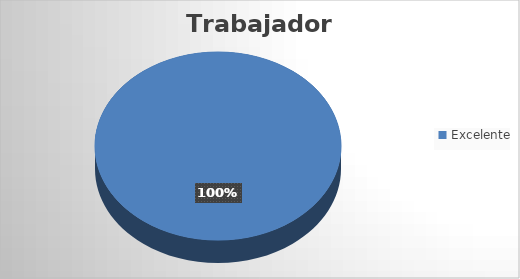
| Category | Cantidad |
|---|---|
| Excelente | 5 |